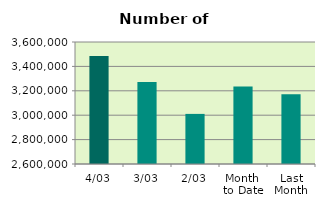
| Category | Series 0 |
|---|---|
| 4/03 | 3486224 |
| 3/03 | 3273090 |
| 2/03 | 3010654 |
| Month 
to Date | 3234436.5 |
| Last
Month | 3172414.4 |